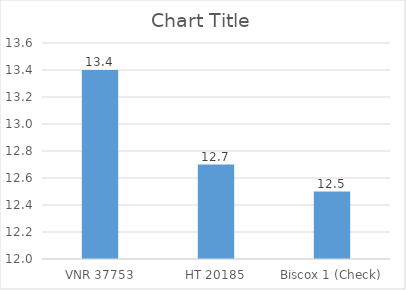
| Category | Series 0 |
|---|---|
| VNR 37753 | 13.4 |
| HT 20185 | 12.7 |
| Biscox 1 (Check) | 12.5 |